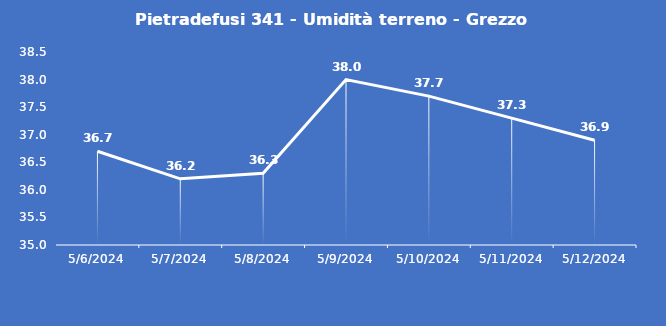
| Category | Pietradefusi 341 - Umidità terreno - Grezzo (%VWC) |
|---|---|
| 5/6/24 | 36.7 |
| 5/7/24 | 36.2 |
| 5/8/24 | 36.3 |
| 5/9/24 | 38 |
| 5/10/24 | 37.7 |
| 5/11/24 | 37.3 |
| 5/12/24 | 36.9 |